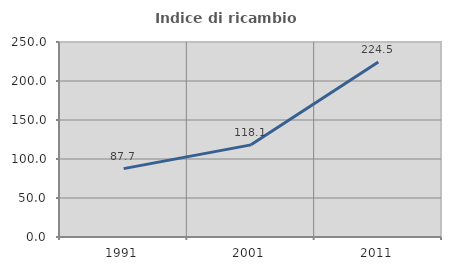
| Category | Indice di ricambio occupazionale  |
|---|---|
| 1991.0 | 87.692 |
| 2001.0 | 118.142 |
| 2011.0 | 224.468 |